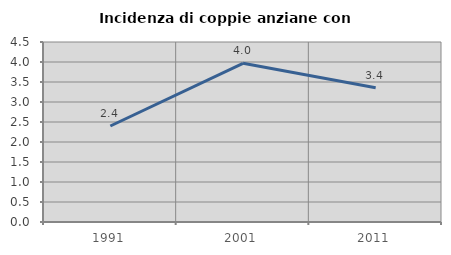
| Category | Incidenza di coppie anziane con figli |
|---|---|
| 1991.0 | 2.4 |
| 2001.0 | 3.967 |
| 2011.0 | 3.357 |